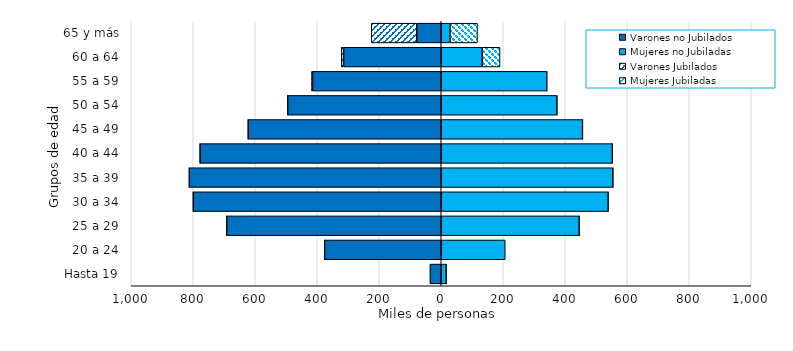
| Category | Varones no Jubilados | Mujeres no Jubiladas | Varones Jubilados | Mujeres Jubiladas |
|---|---|---|---|---|
| Hasta 19 | -36329 | 16312 | 0 | 1 |
| 20 a 24 | -376463 | 206403 | -1 | 0 |
| 25 a 29 | -692438 | 445481 | -11 | 2 |
| 30 a 34 | -800435 | 538734 | -25 | 9 |
| 35 a 39 | -813218 | 554125 | -73 | 22 |
| 40 a 44 | -778292 | 552284 | -148 | 48 |
| 45 a 49 | -623072 | 456119 | -351 | 131 |
| 50 a 54 | -495387 | 373517 | -721 | 272 |
| 55 a 59 | -415235 | 340486 | -2855 | 1142 |
| 60 a 64 | -315131 | 132292 | -7173 | 57409 |
| 65 y más | -79083 | 28314 | -146661 | 88564 |